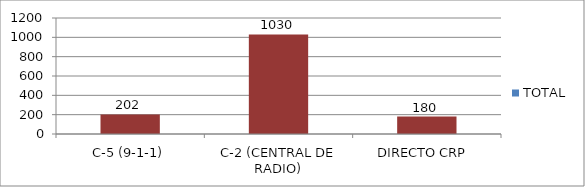
| Category | TOTAL |
|---|---|
| C-5 (9-1-1) | 202 |
| C-2 (CENTRAL DE RADIO) | 1030 |
| DIRECTO CRP  | 180 |